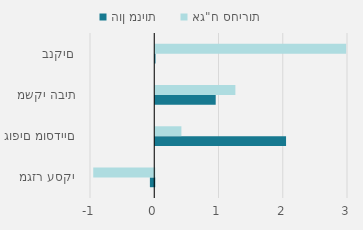
| Category | הון מניות | אג"ח סחירות |
|---|---|---|
| מגזר עסקי | -67.799 | -949.638 |
| גופים מוסדיים | 2035.802 | 406.961 |
|  משקי הבית | 941 | 1247.226 |
| בנקים | 4 | 2971 |